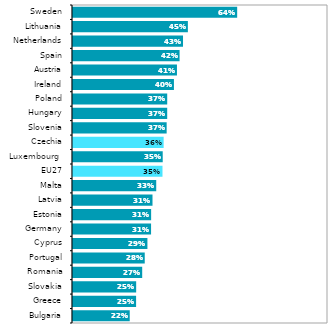
| Category | Series 1 |
|---|---|
| Bulgaria | 0.222 |
| Greece | 0.247 |
| Slovakia | 0.248 |
| Romania | 0.271 |
| Portugal | 0.281 |
| Cyprus | 0.292 |
| Germany | 0.306 |
| Estonia | 0.306 |
| Latvia | 0.312 |
| Malta | 0.326 |
| EU27 | 0.351 |
| Luxembourg  | 0.352 |
| Czechia | 0.355 |
| Slovenia | 0.367 |
| Hungary | 0.369 |
| Poland | 0.369 |
| Ireland | 0.396 |
| Austria | 0.408 |
| Spain | 0.418 |
| Netherlands | 0.431 |
| Lithuania | 0.45 |
| Sweden | 0.644 |